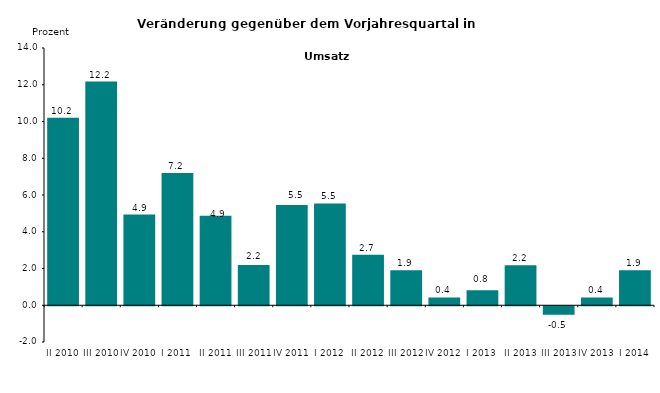
| Category | Series 0 |
|---|---|
| II 2010 | 10.198 |
| III 2010 | 12.174 |
| IV 2010 | 4.934 |
| I 2011 | 7.201 |
| II 2011 | 4.867 |
| III 2011 | 2.186 |
| IV 2011 | 5.454 |
| I 2012 | 5.54 |
| II 2012 | 2.745 |
| III 2012 | 1.908 |
| IV 2012 | 0.427 |
| I 2013 | 0.81 |
| II 2013 | 2.181 |
| III 2013 | -0.465 |
| IV 2013 | 0.426 |
| I 2014 | 1.9 |